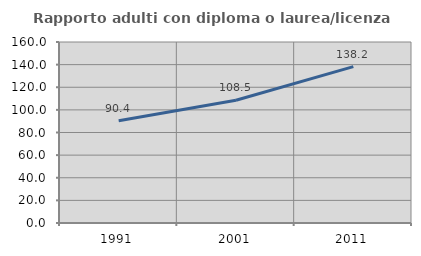
| Category | Rapporto adulti con diploma o laurea/licenza media  |
|---|---|
| 1991.0 | 90.363 |
| 2001.0 | 108.516 |
| 2011.0 | 138.231 |